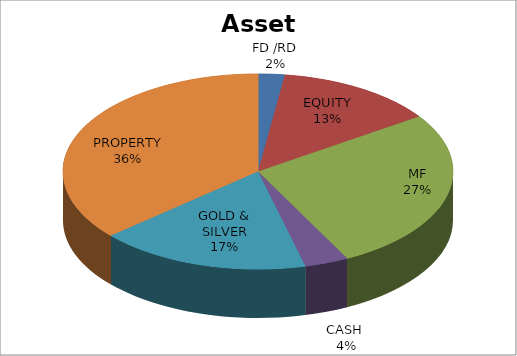
| Category | Series 0 |
|---|---|
| FD /RD | 150420 |
| EQUITY | 909644.14 |
| MF | 1854000 |
| CASH  | 250000 |
| GOLD & SILVER | 1200000 |
| PROPERTY | 2500000 |